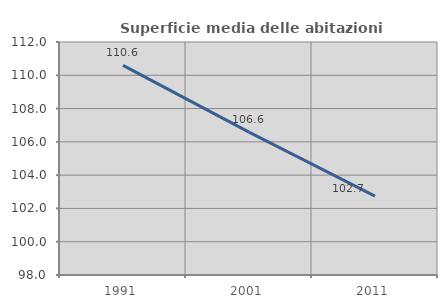
| Category | Superficie media delle abitazioni occupate |
|---|---|
| 1991.0 | 110.596 |
| 2001.0 | 106.589 |
| 2011.0 | 102.744 |